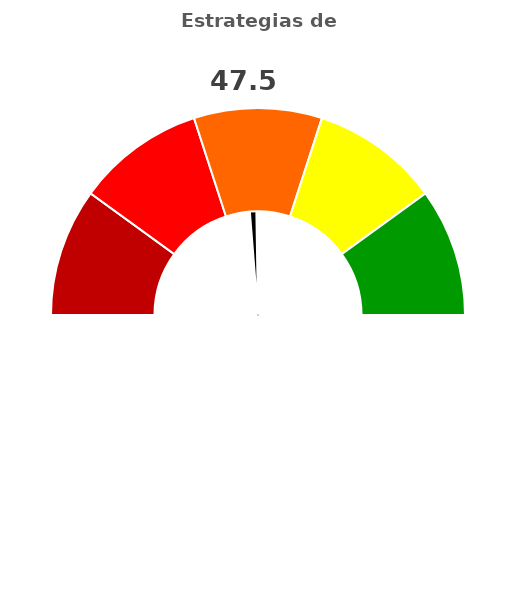
| Category | refe |
|---|---|
| 0 | 47.5 |
| 1 | 2 |
| 2 | 150.5 |